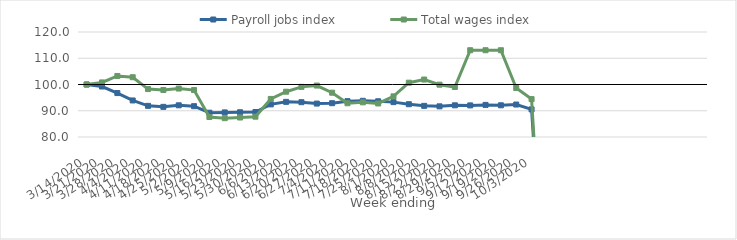
| Category | Payroll jobs index | Total wages index |
|---|---|---|
| 14/03/2020 | 100 | 100 |
| 21/03/2020 | 99.236 | 100.786 |
| 28/03/2020 | 96.736 | 103.251 |
| 04/04/2020 | 93.92 | 102.777 |
| 11/04/2020 | 91.869 | 98.258 |
| 18/04/2020 | 91.486 | 97.897 |
| 25/04/2020 | 92.075 | 98.458 |
| 02/05/2020 | 91.743 | 97.885 |
| 09/05/2020 | 89.26 | 87.617 |
| 16/05/2020 | 89.372 | 87.172 |
| 23/05/2020 | 89.425 | 87.418 |
| 30/05/2020 | 89.508 | 87.74 |
| 06/06/2020 | 92.423 | 94.502 |
| 13/06/2020 | 93.389 | 97.255 |
| 20/06/2020 | 93.26 | 99.097 |
| 27/06/2020 | 92.734 | 99.6 |
| 04/07/2020 | 92.879 | 96.879 |
| 11/07/2020 | 93.644 | 92.857 |
| 18/07/2020 | 93.788 | 93.208 |
| 25/07/2020 | 93.612 | 92.773 |
| 01/08/2020 | 93.287 | 95.485 |
| 08/08/2020 | 92.493 | 100.696 |
| 15/08/2020 | 91.864 | 101.89 |
| 22/08/2020 | 91.678 | 99.931 |
| 29/08/2020 | 92.07 | 99.053 |
| 05/09/2020 | 92.04 | 113.058 |
| 12/09/2020 | 92.228 | 113.056 |
| 19/09/2020 | 92.079 | 113.054 |
| 26/09/2020 | 92.368 | 98.668 |
| 03/10/2020 | 90.519 | 94.433 |